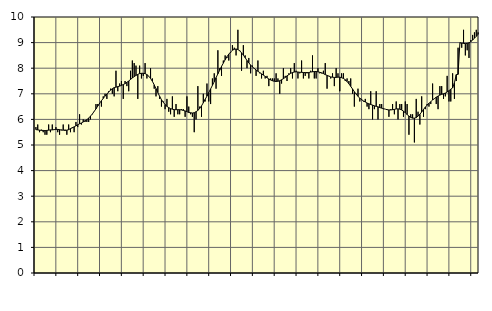
| Category | Piggar | Series 1 |
|---|---|---|
| nan | 5.7 | 5.6 |
| 1.0 | 5.8 | 5.59 |
| 1.0 | 5.5 | 5.58 |
| 1.0 | 5.6 | 5.57 |
| 1.0 | 5.5 | 5.57 |
| 1.0 | 5.4 | 5.56 |
| 1.0 | 5.4 | 5.57 |
| 1.0 | 5.8 | 5.58 |
| 1.0 | 5.5 | 5.59 |
| 1.0 | 5.8 | 5.59 |
| 1.0 | 5.6 | 5.6 |
| 1.0 | 5.7 | 5.61 |
| nan | 5.5 | 5.61 |
| 2.0 | 5.4 | 5.6 |
| 2.0 | 5.6 | 5.58 |
| 2.0 | 5.8 | 5.58 |
| 2.0 | 5.6 | 5.57 |
| 2.0 | 5.4 | 5.58 |
| 2.0 | 5.8 | 5.6 |
| 2.0 | 5.5 | 5.64 |
| 2.0 | 5.7 | 5.67 |
| 2.0 | 5.5 | 5.71 |
| 2.0 | 5.9 | 5.75 |
| 2.0 | 5.7 | 5.79 |
| nan | 6.2 | 5.83 |
| 3.0 | 5.8 | 5.86 |
| 3.0 | 6 | 5.9 |
| 3.0 | 5.9 | 5.95 |
| 3.0 | 5.9 | 5.99 |
| 3.0 | 5.9 | 6.05 |
| 3.0 | 6 | 6.13 |
| 3.0 | 6.2 | 6.21 |
| 3.0 | 6.3 | 6.31 |
| 3.0 | 6.6 | 6.41 |
| 3.0 | 6.6 | 6.52 |
| 3.0 | 6.6 | 6.63 |
| nan | 6.5 | 6.73 |
| 4.0 | 6.9 | 6.82 |
| 4.0 | 7 | 6.91 |
| 4.0 | 6.8 | 6.99 |
| 4.0 | 7.1 | 7.07 |
| 4.0 | 7.2 | 7.14 |
| 4.0 | 7 | 7.2 |
| 4.0 | 6.9 | 7.24 |
| 4.0 | 7.9 | 7.26 |
| 4.0 | 7.1 | 7.28 |
| 4.0 | 7.4 | 7.3 |
| 4.0 | 7.5 | 7.33 |
| nan | 6.8 | 7.36 |
| 5.0 | 7.5 | 7.4 |
| 5.0 | 7.3 | 7.45 |
| 5.0 | 7.1 | 7.5 |
| 5.0 | 7.9 | 7.56 |
| 5.0 | 8.3 | 7.62 |
| 5.0 | 8.2 | 7.67 |
| 5.0 | 8.1 | 7.72 |
| 5.0 | 6.8 | 7.76 |
| 5.0 | 8.1 | 7.79 |
| 5.0 | 7.6 | 7.8 |
| 5.0 | 7.7 | 7.8 |
| nan | 8.2 | 7.79 |
| 6.0 | 7.6 | 7.75 |
| 6.0 | 7.7 | 7.69 |
| 6.0 | 8 | 7.6 |
| 6.0 | 7.6 | 7.49 |
| 6.0 | 7.2 | 7.35 |
| 6.0 | 6.9 | 7.2 |
| 6.0 | 7.3 | 7.05 |
| 6.0 | 6.8 | 6.9 |
| 6.0 | 6.5 | 6.77 |
| 6.0 | 6.7 | 6.67 |
| 6.0 | 6.4 | 6.58 |
| nan | 6.8 | 6.51 |
| 7.0 | 6.3 | 6.46 |
| 7.0 | 6.2 | 6.42 |
| 7.0 | 6.9 | 6.4 |
| 7.0 | 6.1 | 6.38 |
| 7.0 | 6.6 | 6.38 |
| 7.0 | 6.2 | 6.38 |
| 7.0 | 6.2 | 6.38 |
| 7.0 | 6.4 | 6.37 |
| 7.0 | 6.4 | 6.35 |
| 7.0 | 6.1 | 6.33 |
| 7.0 | 6.9 | 6.3 |
| nan | 6.5 | 6.27 |
| 8.0 | 6.2 | 6.26 |
| 8.0 | 6.1 | 6.25 |
| 8.0 | 5.5 | 6.26 |
| 8.0 | 6 | 6.3 |
| 8.0 | 7.3 | 6.35 |
| 8.0 | 6.5 | 6.43 |
| 8.0 | 6.1 | 6.53 |
| 8.0 | 7 | 6.65 |
| 8.0 | 6.7 | 6.78 |
| 8.0 | 7.4 | 6.91 |
| 8.0 | 6.7 | 7.05 |
| nan | 6.6 | 7.19 |
| 9.0 | 7.6 | 7.33 |
| 9.0 | 7.8 | 7.47 |
| 9.0 | 7.2 | 7.63 |
| 9.0 | 8.7 | 7.78 |
| 9.0 | 8 | 7.92 |
| 9.0 | 7.7 | 8.07 |
| 9.0 | 8.3 | 8.2 |
| 9.0 | 8.5 | 8.33 |
| 9.0 | 8.4 | 8.45 |
| 9.0 | 8.3 | 8.55 |
| 9.0 | 8.6 | 8.63 |
| nan | 8.9 | 8.7 |
| 10.0 | 8.8 | 8.74 |
| 10.0 | 8.5 | 8.75 |
| 10.0 | 9.5 | 8.73 |
| 10.0 | 8.7 | 8.68 |
| 10.0 | 7.9 | 8.6 |
| 10.0 | 8.9 | 8.51 |
| 10.0 | 8.5 | 8.41 |
| 10.0 | 8 | 8.3 |
| 10.0 | 8.4 | 8.21 |
| 10.0 | 7.8 | 8.12 |
| 10.0 | 8.1 | 8.05 |
| nan | 8 | 7.99 |
| 11.0 | 7.7 | 7.93 |
| 11.0 | 8.3 | 7.88 |
| 11.0 | 7.8 | 7.83 |
| 11.0 | 7.6 | 7.78 |
| 11.0 | 7.9 | 7.73 |
| 11.0 | 7.6 | 7.68 |
| 11.0 | 7.7 | 7.63 |
| 11.0 | 7.3 | 7.58 |
| 11.0 | 7.6 | 7.54 |
| 11.0 | 7.6 | 7.51 |
| 11.0 | 7.6 | 7.49 |
| nan | 7.8 | 7.48 |
| 12.0 | 7.6 | 7.49 |
| 12.0 | 7 | 7.51 |
| 12.0 | 7.4 | 7.55 |
| 12.0 | 8 | 7.59 |
| 12.0 | 7.7 | 7.64 |
| 12.0 | 7.5 | 7.7 |
| 12.0 | 7.8 | 7.75 |
| 12.0 | 8 | 7.8 |
| 12.0 | 7.6 | 7.83 |
| 12.0 | 8.2 | 7.85 |
| 12.0 | 7.9 | 7.86 |
| nan | 7.6 | 7.85 |
| 13.0 | 7.8 | 7.84 |
| 13.0 | 8.3 | 7.84 |
| 13.0 | 7.6 | 7.83 |
| 13.0 | 7.7 | 7.83 |
| 13.0 | 7.8 | 7.83 |
| 13.0 | 7.6 | 7.83 |
| 13.0 | 7.9 | 7.85 |
| 13.0 | 8.5 | 7.86 |
| 13.0 | 7.6 | 7.87 |
| 13.0 | 7.6 | 7.87 |
| 13.0 | 8 | 7.86 |
| nan | 7.8 | 7.84 |
| 14.0 | 7.8 | 7.82 |
| 14.0 | 7.9 | 7.79 |
| 14.0 | 8.2 | 7.75 |
| 14.0 | 7.2 | 7.72 |
| 14.0 | 7.7 | 7.69 |
| 14.0 | 7.6 | 7.66 |
| 14.0 | 7.8 | 7.65 |
| 14.0 | 7.3 | 7.64 |
| 14.0 | 8 | 7.64 |
| 14.0 | 7.8 | 7.65 |
| 14.0 | 7.1 | 7.65 |
| nan | 7.8 | 7.63 |
| 15.0 | 7.8 | 7.6 |
| 15.0 | 7.5 | 7.55 |
| 15.0 | 7.6 | 7.48 |
| 15.0 | 7.5 | 7.39 |
| 15.0 | 7.6 | 7.29 |
| 15.0 | 7 | 7.19 |
| 15.0 | 6.5 | 7.08 |
| 15.0 | 7 | 6.99 |
| 15.0 | 7.2 | 6.9 |
| 15.0 | 6.7 | 6.83 |
| 15.0 | 6.8 | 6.77 |
| nan | 6.7 | 6.72 |
| 16.0 | 6.8 | 6.68 |
| 16.0 | 6.5 | 6.64 |
| 16.0 | 6.4 | 6.61 |
| 16.0 | 7.1 | 6.58 |
| 16.0 | 6 | 6.56 |
| 16.0 | 6.4 | 6.53 |
| 16.0 | 7.1 | 6.51 |
| 16.0 | 6 | 6.49 |
| 16.0 | 6.6 | 6.46 |
| 16.0 | 6.6 | 6.44 |
| 16.0 | 6.4 | 6.42 |
| nan | 6.4 | 6.4 |
| 17.0 | 6.4 | 6.38 |
| 17.0 | 6.1 | 6.37 |
| 17.0 | 6.4 | 6.37 |
| 17.0 | 6.6 | 6.38 |
| 17.0 | 6.2 | 6.39 |
| 17.0 | 6.7 | 6.41 |
| 17.0 | 6 | 6.41 |
| 17.0 | 6.6 | 6.4 |
| 17.0 | 6.6 | 6.37 |
| 17.0 | 6.1 | 6.32 |
| 17.0 | 6.7 | 6.26 |
| nan | 6.6 | 6.19 |
| 18.0 | 5.4 | 6.13 |
| 18.0 | 6.2 | 6.08 |
| 18.0 | 6.2 | 6.05 |
| 18.0 | 5.1 | 6.05 |
| 18.0 | 6.8 | 6.07 |
| 18.0 | 6.3 | 6.13 |
| 18.0 | 5.8 | 6.2 |
| 18.0 | 6.9 | 6.29 |
| 18.0 | 6.1 | 6.39 |
| 18.0 | 6.4 | 6.48 |
| 18.0 | 6.6 | 6.56 |
| nan | 6.5 | 6.63 |
| 19.0 | 6.6 | 6.69 |
| 19.0 | 7.4 | 6.76 |
| 19.0 | 6.8 | 6.81 |
| 19.0 | 6.6 | 6.87 |
| 19.0 | 6.4 | 6.91 |
| 19.0 | 7.3 | 6.95 |
| 19.0 | 7.3 | 6.98 |
| 19.0 | 6.8 | 7 |
| 19.0 | 6.9 | 7.03 |
| 19.0 | 7.7 | 7.07 |
| 19.0 | 6.7 | 7.12 |
| nan | 6.7 | 7.18 |
| 20.0 | 7.8 | 7.23 |
| 20.0 | 6.8 | 7.43 |
| 20.0 | 7.5 | 7.75 |
| 20.0 | 8.8 | 7.76 |
| 20.0 | 9 | 8.99 |
| 20.0 | 8.8 | 8.98 |
| 20.0 | 9.5 | 8.97 |
| 20.0 | 8.5 | 8.96 |
| 20.0 | 8.7 | 8.97 |
| 20.0 | 8.4 | 8.99 |
| 20.0 | 9.1 | 9.04 |
| nan | 9.3 | 9.1 |
| 21.0 | 9.4 | 9.17 |
| 21.0 | 9.5 | 9.25 |
| 21.0 | 9.4 | 9.32 |